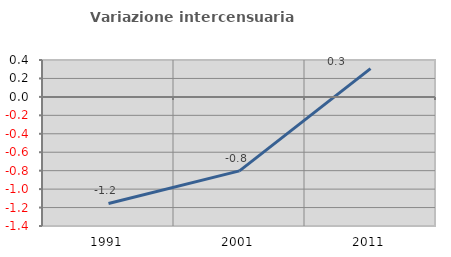
| Category | Variazione intercensuaria annua |
|---|---|
| 1991.0 | -1.155 |
| 2001.0 | -0.802 |
| 2011.0 | 0.306 |